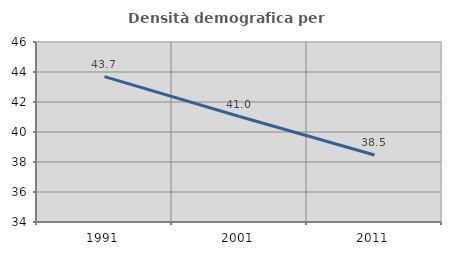
| Category | Densità demografica |
|---|---|
| 1991.0 | 43.692 |
| 2001.0 | 41.032 |
| 2011.0 | 38.468 |